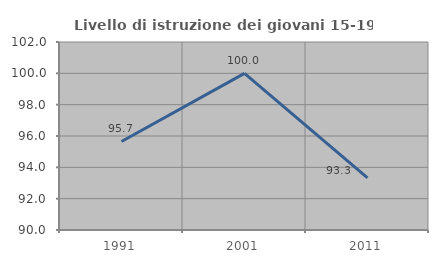
| Category | Livello di istruzione dei giovani 15-19 anni |
|---|---|
| 1991.0 | 95.652 |
| 2001.0 | 100 |
| 2011.0 | 93.333 |